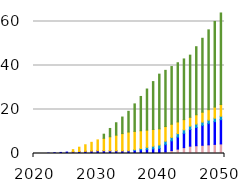
| Category | battery | crude oil | hydro | natural gas | resid | solar | wind |
|---|---|---|---|---|---|---|---|
| 2020.0 | 0 | 0 | 0 | 0 | 0 | 0 | 0 |
| 2021.0 | 0 | 0 | 0 | 0 | 0 | -0.001 | 0 |
| 2022.0 | 0 | 0 | 0.163 | 0 | 0 | -0.001 | 0 |
| 2023.0 | 0 | 0 | 0.326 | 0 | 0 | -0.001 | -0.001 |
| 2024.0 | 0 | 0 | 0.488 | 0 | 0 | -0.002 | -0.001 |
| 2025.0 | 0 | 0 | 0.651 | 0 | 0 | -0.002 | -0.002 |
| 2026.0 | 0 | 0 | 0.765 | 0 | 0.038 | 0.953 | -0.002 |
| 2027.0 | 0 | 0 | 0.879 | 0 | 0.075 | 1.909 | -0.002 |
| 2028.0 | 0 | 0 | 0.993 | 0 | 0.113 | 2.864 | -0.002 |
| 2029.0 | 0 | 0 | 1.107 | 0 | 0.151 | 3.819 | -0.002 |
| 2030.0 | 0 | 0 | 1.221 | 0 | 0.188 | 4.775 | -0.002 |
| 2031.0 | 0 | 0 | 1.221 | 0 | 0.151 | 5.528 | 1.88 |
| 2032.0 | 0 | 0 | 1.221 | 0 | 0.113 | 6.282 | 3.762 |
| 2033.0 | 0 | 0 | 1.221 | 0 | 0.075 | 7.035 | 5.643 |
| 2034.0 | 0 | 0 | 1.221 | 0 | 0.038 | 7.789 | 7.525 |
| 2035.0 | 0 | 0 | 1.221 | 0 | 0 | 8.543 | 9.407 |
| 2036.0 | 0 | 0 | 1.437 | 0.312 | 0 | 8.302 | 12.498 |
| 2037.0 | 0 | 0 | 1.653 | 0.624 | 0 | 8.062 | 15.59 |
| 2038.0 | 0 | 0 | 1.869 | 0.936 | 0 | 7.821 | 18.682 |
| 2039.0 | 0 | 0 | 2.085 | 1.248 | 0 | 7.581 | 21.774 |
| 2040.0 | 0 | 0 | 2.3 | 1.56 | 0 | 7.34 | 24.865 |
| 2041.0 | 0.666 | 0 | 3.358 | 1.56 | 0 | 6.667 | 25.543 |
| 2042.0 | 1.333 | 0 | 4.416 | 1.56 | 0 | 5.994 | 26.221 |
| 2043.0 | 1.999 | 0 | 5.473 | 1.56 | 0 | 5.321 | 26.898 |
| 2044.0 | 2.665 | 0 | 6.531 | 1.56 | 0 | 4.647 | 27.576 |
| 2045.0 | 3.331 | 0 | 7.588 | 1.56 | 0 | 3.974 | 28.254 |
| 2046.0 | 3.535 | 0 | 8.278 | 1.56 | 0 | 4.241 | 30.926 |
| 2047.0 | 3.74 | 0 | 8.968 | 1.56 | 0 | 4.508 | 33.598 |
| 2048.0 | 3.944 | 0 | 9.657 | 1.56 | 0 | 4.775 | 36.27 |
| 2049.0 | 4.148 | 0 | 10.347 | 1.56 | 0 | 5.042 | 38.942 |
| 2050.0 | 4.352 | 0 | 11.037 | 1.56 | 0 | 5.309 | 41.614 |